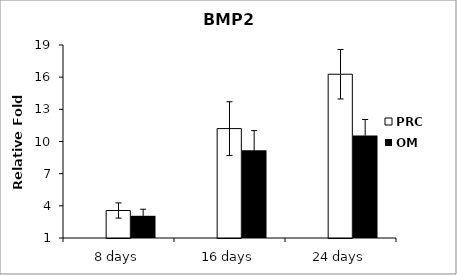
| Category | FBS | PRC | OM |
|---|---|---|---|
| 8 days |  | 3.564 | 3.071 |
| 16 days |  | 11.204 | 9.183 |
| 24 days |  | 16.274 | 10.567 |